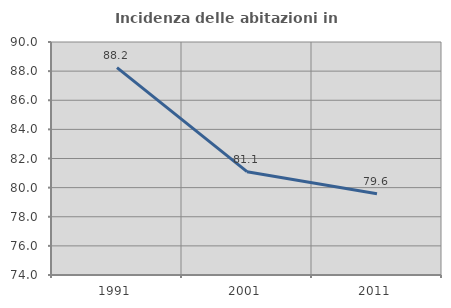
| Category | Incidenza delle abitazioni in proprietà  |
|---|---|
| 1991.0 | 88.235 |
| 2001.0 | 81.093 |
| 2011.0 | 79.579 |